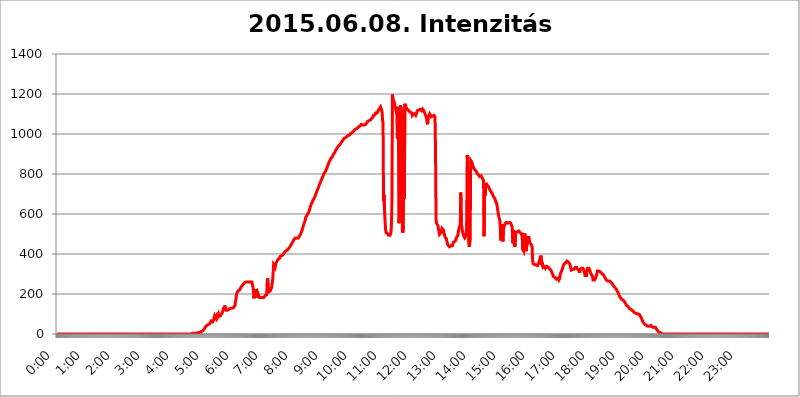
| Category | 2015.06.08. Intenzitás [W/m^2] |
|---|---|
| 0.0 | 0 |
| 0.0006944444444444445 | 0 |
| 0.001388888888888889 | 0 |
| 0.0020833333333333333 | 0 |
| 0.002777777777777778 | 0 |
| 0.003472222222222222 | 0 |
| 0.004166666666666667 | 0 |
| 0.004861111111111111 | 0 |
| 0.005555555555555556 | 0 |
| 0.0062499999999999995 | 0 |
| 0.006944444444444444 | 0 |
| 0.007638888888888889 | 0 |
| 0.008333333333333333 | 0 |
| 0.009027777777777779 | 0 |
| 0.009722222222222222 | 0 |
| 0.010416666666666666 | 0 |
| 0.011111111111111112 | 0 |
| 0.011805555555555555 | 0 |
| 0.012499999999999999 | 0 |
| 0.013194444444444444 | 0 |
| 0.013888888888888888 | 0 |
| 0.014583333333333332 | 0 |
| 0.015277777777777777 | 0 |
| 0.015972222222222224 | 0 |
| 0.016666666666666666 | 0 |
| 0.017361111111111112 | 0 |
| 0.018055555555555557 | 0 |
| 0.01875 | 0 |
| 0.019444444444444445 | 0 |
| 0.02013888888888889 | 0 |
| 0.020833333333333332 | 0 |
| 0.02152777777777778 | 0 |
| 0.022222222222222223 | 0 |
| 0.02291666666666667 | 0 |
| 0.02361111111111111 | 0 |
| 0.024305555555555556 | 0 |
| 0.024999999999999998 | 0 |
| 0.025694444444444447 | 0 |
| 0.02638888888888889 | 0 |
| 0.027083333333333334 | 0 |
| 0.027777777777777776 | 0 |
| 0.02847222222222222 | 0 |
| 0.029166666666666664 | 0 |
| 0.029861111111111113 | 0 |
| 0.030555555555555555 | 0 |
| 0.03125 | 0 |
| 0.03194444444444445 | 0 |
| 0.03263888888888889 | 0 |
| 0.03333333333333333 | 0 |
| 0.034027777777777775 | 0 |
| 0.034722222222222224 | 0 |
| 0.035416666666666666 | 0 |
| 0.036111111111111115 | 0 |
| 0.03680555555555556 | 0 |
| 0.0375 | 0 |
| 0.03819444444444444 | 0 |
| 0.03888888888888889 | 0 |
| 0.03958333333333333 | 0 |
| 0.04027777777777778 | 0 |
| 0.04097222222222222 | 0 |
| 0.041666666666666664 | 0 |
| 0.042361111111111106 | 0 |
| 0.04305555555555556 | 0 |
| 0.043750000000000004 | 0 |
| 0.044444444444444446 | 0 |
| 0.04513888888888889 | 0 |
| 0.04583333333333334 | 0 |
| 0.04652777777777778 | 0 |
| 0.04722222222222222 | 0 |
| 0.04791666666666666 | 0 |
| 0.04861111111111111 | 0 |
| 0.049305555555555554 | 0 |
| 0.049999999999999996 | 0 |
| 0.05069444444444445 | 0 |
| 0.051388888888888894 | 0 |
| 0.052083333333333336 | 0 |
| 0.05277777777777778 | 0 |
| 0.05347222222222222 | 0 |
| 0.05416666666666667 | 0 |
| 0.05486111111111111 | 0 |
| 0.05555555555555555 | 0 |
| 0.05625 | 0 |
| 0.05694444444444444 | 0 |
| 0.057638888888888885 | 0 |
| 0.05833333333333333 | 0 |
| 0.05902777777777778 | 0 |
| 0.059722222222222225 | 0 |
| 0.06041666666666667 | 0 |
| 0.061111111111111116 | 0 |
| 0.06180555555555556 | 0 |
| 0.0625 | 0 |
| 0.06319444444444444 | 0 |
| 0.06388888888888888 | 0 |
| 0.06458333333333334 | 0 |
| 0.06527777777777778 | 0 |
| 0.06597222222222222 | 0 |
| 0.06666666666666667 | 0 |
| 0.06736111111111111 | 0 |
| 0.06805555555555555 | 0 |
| 0.06874999999999999 | 0 |
| 0.06944444444444443 | 0 |
| 0.07013888888888889 | 0 |
| 0.07083333333333333 | 0 |
| 0.07152777777777779 | 0 |
| 0.07222222222222223 | 0 |
| 0.07291666666666667 | 0 |
| 0.07361111111111111 | 0 |
| 0.07430555555555556 | 0 |
| 0.075 | 0 |
| 0.07569444444444444 | 0 |
| 0.0763888888888889 | 0 |
| 0.07708333333333334 | 0 |
| 0.07777777777777778 | 0 |
| 0.07847222222222222 | 0 |
| 0.07916666666666666 | 0 |
| 0.0798611111111111 | 0 |
| 0.08055555555555556 | 0 |
| 0.08125 | 0 |
| 0.08194444444444444 | 0 |
| 0.08263888888888889 | 0 |
| 0.08333333333333333 | 0 |
| 0.08402777777777777 | 0 |
| 0.08472222222222221 | 0 |
| 0.08541666666666665 | 0 |
| 0.08611111111111112 | 0 |
| 0.08680555555555557 | 0 |
| 0.08750000000000001 | 0 |
| 0.08819444444444445 | 0 |
| 0.08888888888888889 | 0 |
| 0.08958333333333333 | 0 |
| 0.09027777777777778 | 0 |
| 0.09097222222222222 | 0 |
| 0.09166666666666667 | 0 |
| 0.09236111111111112 | 0 |
| 0.09305555555555556 | 0 |
| 0.09375 | 0 |
| 0.09444444444444444 | 0 |
| 0.09513888888888888 | 0 |
| 0.09583333333333333 | 0 |
| 0.09652777777777777 | 0 |
| 0.09722222222222222 | 0 |
| 0.09791666666666667 | 0 |
| 0.09861111111111111 | 0 |
| 0.09930555555555555 | 0 |
| 0.09999999999999999 | 0 |
| 0.10069444444444443 | 0 |
| 0.1013888888888889 | 0 |
| 0.10208333333333335 | 0 |
| 0.10277777777777779 | 0 |
| 0.10347222222222223 | 0 |
| 0.10416666666666667 | 0 |
| 0.10486111111111111 | 0 |
| 0.10555555555555556 | 0 |
| 0.10625 | 0 |
| 0.10694444444444444 | 0 |
| 0.1076388888888889 | 0 |
| 0.10833333333333334 | 0 |
| 0.10902777777777778 | 0 |
| 0.10972222222222222 | 0 |
| 0.1111111111111111 | 0 |
| 0.11180555555555556 | 0 |
| 0.11180555555555556 | 0 |
| 0.1125 | 0 |
| 0.11319444444444444 | 0 |
| 0.11388888888888889 | 0 |
| 0.11458333333333333 | 0 |
| 0.11527777777777777 | 0 |
| 0.11597222222222221 | 0 |
| 0.11666666666666665 | 0 |
| 0.1173611111111111 | 0 |
| 0.11805555555555557 | 0 |
| 0.11944444444444445 | 0 |
| 0.12013888888888889 | 0 |
| 0.12083333333333333 | 0 |
| 0.12152777777777778 | 0 |
| 0.12222222222222223 | 0 |
| 0.12291666666666667 | 0 |
| 0.12291666666666667 | 0 |
| 0.12361111111111112 | 0 |
| 0.12430555555555556 | 0 |
| 0.125 | 0 |
| 0.12569444444444444 | 0 |
| 0.12638888888888888 | 0 |
| 0.12708333333333333 | 0 |
| 0.16875 | 0 |
| 0.12847222222222224 | 0 |
| 0.12916666666666668 | 0 |
| 0.12986111111111112 | 0 |
| 0.13055555555555556 | 0 |
| 0.13125 | 0 |
| 0.13194444444444445 | 0 |
| 0.1326388888888889 | 0 |
| 0.13333333333333333 | 0 |
| 0.13402777777777777 | 0 |
| 0.13402777777777777 | 0 |
| 0.13472222222222222 | 0 |
| 0.13541666666666666 | 0 |
| 0.1361111111111111 | 0 |
| 0.13749999999999998 | 0 |
| 0.13819444444444443 | 0 |
| 0.1388888888888889 | 0 |
| 0.13958333333333334 | 0 |
| 0.14027777777777778 | 0 |
| 0.14097222222222222 | 0 |
| 0.14166666666666666 | 0 |
| 0.1423611111111111 | 0 |
| 0.14305555555555557 | 0 |
| 0.14375000000000002 | 0 |
| 0.14444444444444446 | 0 |
| 0.1451388888888889 | 0 |
| 0.1451388888888889 | 0 |
| 0.14652777777777778 | 0 |
| 0.14722222222222223 | 0 |
| 0.14791666666666667 | 0 |
| 0.1486111111111111 | 0 |
| 0.14930555555555555 | 0 |
| 0.15 | 0 |
| 0.15069444444444444 | 0 |
| 0.15138888888888888 | 0 |
| 0.15208333333333332 | 0 |
| 0.15277777777777776 | 0 |
| 0.15347222222222223 | 0 |
| 0.15416666666666667 | 0 |
| 0.15486111111111112 | 0 |
| 0.15555555555555556 | 0 |
| 0.15625 | 0 |
| 0.15694444444444444 | 0 |
| 0.15763888888888888 | 0 |
| 0.15833333333333333 | 0 |
| 0.15902777777777777 | 0 |
| 0.15972222222222224 | 0 |
| 0.16041666666666668 | 0 |
| 0.16111111111111112 | 0 |
| 0.16180555555555556 | 0 |
| 0.1625 | 0 |
| 0.16319444444444445 | 0 |
| 0.1638888888888889 | 0 |
| 0.16458333333333333 | 0 |
| 0.16527777777777777 | 0 |
| 0.16597222222222222 | 0 |
| 0.16666666666666666 | 0 |
| 0.1673611111111111 | 0 |
| 0.16805555555555554 | 0 |
| 0.16874999999999998 | 0 |
| 0.16944444444444443 | 0 |
| 0.17013888888888887 | 0 |
| 0.1708333333333333 | 0 |
| 0.17152777777777775 | 0 |
| 0.17222222222222225 | 0 |
| 0.1729166666666667 | 0 |
| 0.17361111111111113 | 0 |
| 0.17430555555555557 | 0 |
| 0.17500000000000002 | 0 |
| 0.17569444444444446 | 0 |
| 0.1763888888888889 | 0 |
| 0.17708333333333334 | 0 |
| 0.17777777777777778 | 0 |
| 0.17847222222222223 | 0 |
| 0.17916666666666667 | 0 |
| 0.1798611111111111 | 0 |
| 0.18055555555555555 | 0 |
| 0.18125 | 0 |
| 0.18194444444444444 | 0 |
| 0.1826388888888889 | 0 |
| 0.18333333333333335 | 0 |
| 0.1840277777777778 | 0 |
| 0.18472222222222223 | 0 |
| 0.18541666666666667 | 0 |
| 0.18611111111111112 | 0 |
| 0.18680555555555556 | 0 |
| 0.1875 | 0 |
| 0.18819444444444444 | 3.525 |
| 0.18888888888888888 | 3.525 |
| 0.18958333333333333 | 3.525 |
| 0.19027777777777777 | 3.525 |
| 0.1909722222222222 | 3.525 |
| 0.19166666666666665 | 3.525 |
| 0.19236111111111112 | 3.525 |
| 0.19305555555555554 | 3.525 |
| 0.19375 | 3.525 |
| 0.19444444444444445 | 3.525 |
| 0.1951388888888889 | 7.887 |
| 0.19583333333333333 | 3.525 |
| 0.19652777777777777 | 7.887 |
| 0.19722222222222222 | 7.887 |
| 0.19791666666666666 | 7.887 |
| 0.1986111111111111 | 7.887 |
| 0.19930555555555554 | 7.887 |
| 0.19999999999999998 | 7.887 |
| 0.20069444444444443 | 7.887 |
| 0.20138888888888887 | 12.257 |
| 0.2020833333333333 | 12.257 |
| 0.2027777777777778 | 12.257 |
| 0.2034722222222222 | 12.257 |
| 0.2041666666666667 | 16.636 |
| 0.20486111111111113 | 16.636 |
| 0.20555555555555557 | 21.024 |
| 0.20625000000000002 | 25.419 |
| 0.20694444444444446 | 29.823 |
| 0.2076388888888889 | 34.234 |
| 0.20833333333333334 | 38.653 |
| 0.20902777777777778 | 38.653 |
| 0.20972222222222223 | 43.079 |
| 0.21041666666666667 | 43.079 |
| 0.2111111111111111 | 47.511 |
| 0.21180555555555555 | 47.511 |
| 0.2125 | 51.951 |
| 0.21319444444444444 | 51.951 |
| 0.2138888888888889 | 51.951 |
| 0.21458333333333335 | 56.398 |
| 0.2152777777777778 | 56.398 |
| 0.21597222222222223 | 65.31 |
| 0.21666666666666667 | 65.31 |
| 0.21736111111111112 | 60.85 |
| 0.21805555555555556 | 60.85 |
| 0.21875 | 65.31 |
| 0.21944444444444444 | 69.775 |
| 0.22013888888888888 | 83.205 |
| 0.22083333333333333 | 92.184 |
| 0.22152777777777777 | 92.184 |
| 0.2222222222222222 | 83.205 |
| 0.22291666666666665 | 78.722 |
| 0.2236111111111111 | 92.184 |
| 0.22430555555555556 | 78.722 |
| 0.225 | 83.205 |
| 0.22569444444444445 | 87.692 |
| 0.2263888888888889 | 96.682 |
| 0.22708333333333333 | 87.692 |
| 0.22777777777777777 | 87.692 |
| 0.22847222222222222 | 92.184 |
| 0.22916666666666666 | 92.184 |
| 0.2298611111111111 | 96.682 |
| 0.23055555555555554 | 101.184 |
| 0.23124999999999998 | 96.682 |
| 0.23194444444444443 | 110.201 |
| 0.23263888888888887 | 119.235 |
| 0.2333333333333333 | 132.814 |
| 0.2340277777777778 | 119.235 |
| 0.2347222222222222 | 123.758 |
| 0.2354166666666667 | 141.884 |
| 0.23611111111111113 | 128.284 |
| 0.23680555555555557 | 119.235 |
| 0.23750000000000002 | 119.235 |
| 0.23819444444444446 | 119.235 |
| 0.2388888888888889 | 119.235 |
| 0.23958333333333334 | 123.758 |
| 0.24027777777777778 | 123.758 |
| 0.24097222222222223 | 123.758 |
| 0.24166666666666667 | 123.758 |
| 0.2423611111111111 | 128.284 |
| 0.24305555555555555 | 128.284 |
| 0.24375 | 123.758 |
| 0.24444444444444446 | 128.284 |
| 0.24513888888888888 | 128.284 |
| 0.24583333333333335 | 128.284 |
| 0.2465277777777778 | 132.814 |
| 0.24722222222222223 | 132.814 |
| 0.24791666666666667 | 137.347 |
| 0.24861111111111112 | 137.347 |
| 0.24930555555555556 | 141.884 |
| 0.25 | 164.605 |
| 0.25069444444444444 | 173.709 |
| 0.2513888888888889 | 196.497 |
| 0.2520833333333333 | 205.62 |
| 0.25277777777777777 | 210.182 |
| 0.2534722222222222 | 214.746 |
| 0.25416666666666665 | 214.746 |
| 0.2548611111111111 | 219.309 |
| 0.2555555555555556 | 219.309 |
| 0.25625000000000003 | 223.873 |
| 0.2569444444444445 | 228.436 |
| 0.2576388888888889 | 233 |
| 0.25833333333333336 | 237.564 |
| 0.2590277777777778 | 242.127 |
| 0.25972222222222224 | 242.127 |
| 0.2604166666666667 | 246.689 |
| 0.2611111111111111 | 251.251 |
| 0.26180555555555557 | 251.251 |
| 0.2625 | 255.813 |
| 0.26319444444444445 | 260.373 |
| 0.2638888888888889 | 260.373 |
| 0.26458333333333334 | 260.373 |
| 0.2652777777777778 | 260.373 |
| 0.2659722222222222 | 260.373 |
| 0.26666666666666666 | 260.373 |
| 0.2673611111111111 | 260.373 |
| 0.26805555555555555 | 260.373 |
| 0.26875 | 260.373 |
| 0.26944444444444443 | 260.373 |
| 0.2701388888888889 | 260.373 |
| 0.2708333333333333 | 260.373 |
| 0.27152777777777776 | 260.373 |
| 0.2722222222222222 | 260.373 |
| 0.27291666666666664 | 260.373 |
| 0.2736111111111111 | 255.813 |
| 0.2743055555555555 | 237.564 |
| 0.27499999999999997 | 223.873 |
| 0.27569444444444446 | 178.264 |
| 0.27638888888888885 | 182.82 |
| 0.27708333333333335 | 201.058 |
| 0.2777777777777778 | 187.378 |
| 0.27847222222222223 | 223.873 |
| 0.2791666666666667 | 219.309 |
| 0.2798611111111111 | 182.82 |
| 0.28055555555555556 | 178.264 |
| 0.28125 | 205.62 |
| 0.28194444444444444 | 201.058 |
| 0.2826388888888889 | 191.937 |
| 0.2833333333333333 | 182.82 |
| 0.28402777777777777 | 187.378 |
| 0.2847222222222222 | 182.82 |
| 0.28541666666666665 | 182.82 |
| 0.28611111111111115 | 182.82 |
| 0.28680555555555554 | 182.82 |
| 0.28750000000000003 | 182.82 |
| 0.2881944444444445 | 182.82 |
| 0.2888888888888889 | 182.82 |
| 0.28958333333333336 | 182.82 |
| 0.2902777777777778 | 182.82 |
| 0.29097222222222224 | 187.378 |
| 0.2916666666666667 | 191.937 |
| 0.2923611111111111 | 191.937 |
| 0.29305555555555557 | 196.497 |
| 0.29375 | 196.497 |
| 0.29444444444444445 | 260.373 |
| 0.2951388888888889 | 278.603 |
| 0.29583333333333334 | 223.873 |
| 0.2965277777777778 | 210.182 |
| 0.2972222222222222 | 210.182 |
| 0.29791666666666666 | 214.746 |
| 0.2986111111111111 | 214.746 |
| 0.29930555555555555 | 214.746 |
| 0.3 | 219.309 |
| 0.30069444444444443 | 233 |
| 0.3013888888888889 | 233 |
| 0.3020833333333333 | 269.49 |
| 0.30277777777777776 | 264.932 |
| 0.3034722222222222 | 346.682 |
| 0.30416666666666664 | 351.198 |
| 0.3048611111111111 | 342.162 |
| 0.3055555555555555 | 333.113 |
| 0.30624999999999997 | 346.682 |
| 0.3069444444444444 | 355.712 |
| 0.3076388888888889 | 360.221 |
| 0.30833333333333335 | 364.728 |
| 0.3090277777777778 | 369.23 |
| 0.30972222222222223 | 373.729 |
| 0.3104166666666667 | 378.224 |
| 0.3111111111111111 | 378.224 |
| 0.31180555555555556 | 378.224 |
| 0.3125 | 387.202 |
| 0.31319444444444444 | 391.685 |
| 0.3138888888888889 | 391.685 |
| 0.3145833333333333 | 391.685 |
| 0.31527777777777777 | 396.164 |
| 0.3159722222222222 | 396.164 |
| 0.31666666666666665 | 396.164 |
| 0.31736111111111115 | 400.638 |
| 0.31805555555555554 | 405.108 |
| 0.31875000000000003 | 409.574 |
| 0.3194444444444445 | 409.574 |
| 0.3201388888888889 | 414.035 |
| 0.32083333333333336 | 414.035 |
| 0.3215277777777778 | 418.492 |
| 0.32222222222222224 | 418.492 |
| 0.3229166666666667 | 422.943 |
| 0.3236111111111111 | 422.943 |
| 0.32430555555555557 | 427.39 |
| 0.325 | 431.833 |
| 0.32569444444444445 | 431.833 |
| 0.3263888888888889 | 436.27 |
| 0.32708333333333334 | 440.702 |
| 0.3277777777777778 | 445.129 |
| 0.3284722222222222 | 449.551 |
| 0.32916666666666666 | 453.968 |
| 0.3298611111111111 | 458.38 |
| 0.33055555555555555 | 462.786 |
| 0.33125 | 467.187 |
| 0.33194444444444443 | 471.582 |
| 0.3326388888888889 | 471.582 |
| 0.3333333333333333 | 475.972 |
| 0.3340277777777778 | 480.356 |
| 0.3347222222222222 | 480.356 |
| 0.3354166666666667 | 480.356 |
| 0.3361111111111111 | 480.356 |
| 0.3368055555555556 | 480.356 |
| 0.33749999999999997 | 480.356 |
| 0.33819444444444446 | 480.356 |
| 0.33888888888888885 | 484.735 |
| 0.33958333333333335 | 489.108 |
| 0.34027777777777773 | 489.108 |
| 0.34097222222222223 | 493.475 |
| 0.3416666666666666 | 502.192 |
| 0.3423611111111111 | 506.542 |
| 0.3430555555555555 | 515.223 |
| 0.34375 | 523.88 |
| 0.3444444444444445 | 532.513 |
| 0.3451388888888889 | 541.121 |
| 0.3458333333333334 | 549.704 |
| 0.34652777777777777 | 553.986 |
| 0.34722222222222227 | 562.53 |
| 0.34791666666666665 | 571.049 |
| 0.34861111111111115 | 583.779 |
| 0.34930555555555554 | 588.009 |
| 0.35000000000000003 | 592.233 |
| 0.3506944444444444 | 596.45 |
| 0.3513888888888889 | 600.661 |
| 0.3520833333333333 | 604.864 |
| 0.3527777777777778 | 609.062 |
| 0.3534722222222222 | 617.436 |
| 0.3541666666666667 | 625.784 |
| 0.3548611111111111 | 634.105 |
| 0.35555555555555557 | 642.4 |
| 0.35625 | 650.667 |
| 0.35694444444444445 | 654.791 |
| 0.3576388888888889 | 658.909 |
| 0.35833333333333334 | 667.123 |
| 0.3590277777777778 | 671.22 |
| 0.3597222222222222 | 675.311 |
| 0.36041666666666666 | 679.395 |
| 0.3611111111111111 | 683.473 |
| 0.36180555555555555 | 691.608 |
| 0.3625 | 695.666 |
| 0.36319444444444443 | 703.762 |
| 0.3638888888888889 | 711.832 |
| 0.3645833333333333 | 715.858 |
| 0.3652777777777778 | 723.889 |
| 0.3659722222222222 | 727.896 |
| 0.3666666666666667 | 735.89 |
| 0.3673611111111111 | 743.859 |
| 0.3680555555555556 | 747.834 |
| 0.36874999999999997 | 755.766 |
| 0.36944444444444446 | 759.723 |
| 0.37013888888888885 | 767.62 |
| 0.37083333333333335 | 771.559 |
| 0.37152777777777773 | 779.42 |
| 0.37222222222222223 | 783.342 |
| 0.3729166666666666 | 791.169 |
| 0.3736111111111111 | 798.974 |
| 0.3743055555555555 | 802.868 |
| 0.375 | 806.757 |
| 0.3756944444444445 | 806.757 |
| 0.3763888888888889 | 814.519 |
| 0.3770833333333334 | 818.392 |
| 0.37777777777777777 | 826.123 |
| 0.37847222222222227 | 833.834 |
| 0.37916666666666665 | 837.682 |
| 0.37986111111111115 | 845.365 |
| 0.38055555555555554 | 853.029 |
| 0.38125000000000003 | 860.676 |
| 0.3819444444444444 | 864.493 |
| 0.3826388888888889 | 868.305 |
| 0.3833333333333333 | 875.918 |
| 0.3840277777777778 | 879.719 |
| 0.3847222222222222 | 879.719 |
| 0.3854166666666667 | 883.516 |
| 0.3861111111111111 | 887.309 |
| 0.38680555555555557 | 894.885 |
| 0.3875 | 894.885 |
| 0.38819444444444445 | 902.447 |
| 0.3888888888888889 | 906.223 |
| 0.38958333333333334 | 909.996 |
| 0.3902777777777778 | 917.534 |
| 0.3909722222222222 | 921.298 |
| 0.39166666666666666 | 925.06 |
| 0.3923611111111111 | 928.819 |
| 0.39305555555555555 | 932.576 |
| 0.39375 | 936.33 |
| 0.39444444444444443 | 940.082 |
| 0.3951388888888889 | 943.832 |
| 0.3958333333333333 | 943.832 |
| 0.3965277777777778 | 947.58 |
| 0.3972222222222222 | 951.327 |
| 0.3979166666666667 | 955.071 |
| 0.3986111111111111 | 958.814 |
| 0.3993055555555556 | 962.555 |
| 0.39999999999999997 | 966.295 |
| 0.40069444444444446 | 970.034 |
| 0.40138888888888885 | 970.034 |
| 0.40208333333333335 | 977.508 |
| 0.40277777777777773 | 977.508 |
| 0.40347222222222223 | 981.244 |
| 0.4041666666666666 | 981.244 |
| 0.4048611111111111 | 984.98 |
| 0.4055555555555555 | 984.98 |
| 0.40625 | 988.714 |
| 0.4069444444444445 | 992.448 |
| 0.4076388888888889 | 992.448 |
| 0.4083333333333334 | 992.448 |
| 0.40902777777777777 | 996.182 |
| 0.40972222222222227 | 992.448 |
| 0.41041666666666665 | 996.182 |
| 0.41111111111111115 | 996.182 |
| 0.41180555555555554 | 1003.65 |
| 0.41250000000000003 | 1007.383 |
| 0.4131944444444444 | 1007.383 |
| 0.4138888888888889 | 1007.383 |
| 0.4145833333333333 | 1007.383 |
| 0.4152777777777778 | 1011.118 |
| 0.4159722222222222 | 1014.852 |
| 0.4166666666666667 | 1018.587 |
| 0.4173611111111111 | 1022.323 |
| 0.41805555555555557 | 1026.06 |
| 0.41875 | 1026.06 |
| 0.41944444444444445 | 1026.06 |
| 0.4201388888888889 | 1026.06 |
| 0.42083333333333334 | 1029.798 |
| 0.4215277777777778 | 1029.798 |
| 0.4222222222222222 | 1033.537 |
| 0.42291666666666666 | 1037.277 |
| 0.4236111111111111 | 1041.019 |
| 0.42430555555555555 | 1041.019 |
| 0.425 | 1041.019 |
| 0.42569444444444443 | 1044.762 |
| 0.4263888888888889 | 1048.508 |
| 0.4270833333333333 | 1048.508 |
| 0.4277777777777778 | 1048.508 |
| 0.4284722222222222 | 1044.762 |
| 0.4291666666666667 | 1044.762 |
| 0.4298611111111111 | 1044.762 |
| 0.4305555555555556 | 1044.762 |
| 0.43124999999999997 | 1048.508 |
| 0.43194444444444446 | 1048.508 |
| 0.43263888888888885 | 1048.508 |
| 0.43333333333333335 | 1052.255 |
| 0.43402777777777773 | 1056.004 |
| 0.43472222222222223 | 1059.756 |
| 0.4354166666666666 | 1063.51 |
| 0.4361111111111111 | 1063.51 |
| 0.4368055555555555 | 1063.51 |
| 0.4375 | 1067.267 |
| 0.4381944444444445 | 1067.267 |
| 0.4388888888888889 | 1067.267 |
| 0.4395833333333334 | 1071.027 |
| 0.44027777777777777 | 1074.789 |
| 0.44097222222222227 | 1078.555 |
| 0.44166666666666665 | 1082.324 |
| 0.44236111111111115 | 1082.324 |
| 0.44305555555555554 | 1086.097 |
| 0.44375000000000003 | 1093.653 |
| 0.4444444444444444 | 1093.653 |
| 0.4451388888888889 | 1093.653 |
| 0.4458333333333333 | 1097.437 |
| 0.4465277777777778 | 1105.019 |
| 0.4472222222222222 | 1105.019 |
| 0.4479166666666667 | 1101.226 |
| 0.4486111111111111 | 1105.019 |
| 0.44930555555555557 | 1108.816 |
| 0.45 | 1116.426 |
| 0.45069444444444445 | 1112.618 |
| 0.4513888888888889 | 1124.056 |
| 0.45208333333333334 | 1124.056 |
| 0.4527777777777778 | 1127.879 |
| 0.4534722222222222 | 1135.543 |
| 0.45416666666666666 | 1131.708 |
| 0.4548611111111111 | 1135.543 |
| 0.45555555555555555 | 1112.618 |
| 0.45625 | 1071.027 |
| 0.45694444444444443 | 1056.004 |
| 0.4576388888888889 | 667.123 |
| 0.4583333333333333 | 695.666 |
| 0.4590277777777778 | 617.436 |
| 0.4597222222222222 | 566.793 |
| 0.4604166666666667 | 523.88 |
| 0.4611111111111111 | 506.542 |
| 0.4618055555555556 | 506.542 |
| 0.46249999999999997 | 502.192 |
| 0.46319444444444446 | 502.192 |
| 0.46388888888888885 | 497.836 |
| 0.46458333333333335 | 493.475 |
| 0.46527777777777773 | 489.108 |
| 0.46597222222222223 | 493.475 |
| 0.4666666666666666 | 493.475 |
| 0.4673611111111111 | 497.836 |
| 0.4680555555555555 | 506.542 |
| 0.46875 | 553.986 |
| 0.4694444444444445 | 667.123 |
| 0.4701388888888889 | 1197.876 |
| 0.4708333333333334 | 1174.263 |
| 0.47152777777777777 | 1174.263 |
| 0.47222222222222227 | 1162.571 |
| 0.47291666666666665 | 1154.814 |
| 0.47361111111111115 | 1143.232 |
| 0.47430555555555554 | 1139.384 |
| 0.47500000000000003 | 1139.384 |
| 0.4756944444444444 | 1108.816 |
| 0.4763888888888889 | 1093.653 |
| 0.4770833333333333 | 977.508 |
| 0.4777777777777778 | 1135.543 |
| 0.4784722222222222 | 1108.816 |
| 0.4791666666666667 | 553.986 |
| 0.4798611111111111 | 583.779 |
| 0.48055555555555557 | 1007.383 |
| 0.48125 | 1143.232 |
| 0.48194444444444445 | 1135.543 |
| 0.4826388888888889 | 1124.056 |
| 0.48333333333333334 | 1101.226 |
| 0.4840277777777778 | 515.223 |
| 0.4847222222222222 | 506.542 |
| 0.48541666666666666 | 541.121 |
| 0.4861111111111111 | 1022.323 |
| 0.48680555555555555 | 675.311 |
| 0.4875 | 1150.946 |
| 0.48819444444444443 | 1150.946 |
| 0.4888888888888889 | 1135.543 |
| 0.4895833333333333 | 1131.708 |
| 0.4902777777777778 | 1131.708 |
| 0.4909722222222222 | 1124.056 |
| 0.4916666666666667 | 1120.238 |
| 0.4923611111111111 | 1120.238 |
| 0.4930555555555556 | 1116.426 |
| 0.49374999999999997 | 1116.426 |
| 0.49444444444444446 | 1112.618 |
| 0.49513888888888885 | 1108.816 |
| 0.49583333333333335 | 1108.816 |
| 0.49652777777777773 | 1105.019 |
| 0.49722222222222223 | 1105.019 |
| 0.4979166666666666 | 1093.653 |
| 0.4986111111111111 | 1089.873 |
| 0.4993055555555555 | 1101.226 |
| 0.5 | 1105.019 |
| 0.5006944444444444 | 1101.226 |
| 0.5013888888888889 | 1101.226 |
| 0.5020833333333333 | 1097.437 |
| 0.5027777777777778 | 1093.653 |
| 0.5034722222222222 | 1097.437 |
| 0.5041666666666667 | 1105.019 |
| 0.5048611111111111 | 1116.426 |
| 0.5055555555555555 | 1116.426 |
| 0.50625 | 1120.238 |
| 0.5069444444444444 | 1120.238 |
| 0.5076388888888889 | 1120.238 |
| 0.5083333333333333 | 1120.238 |
| 0.5090277777777777 | 1124.056 |
| 0.5097222222222222 | 1124.056 |
| 0.5104166666666666 | 1120.238 |
| 0.5111111111111112 | 1116.426 |
| 0.5118055555555555 | 1120.238 |
| 0.5125000000000001 | 1124.056 |
| 0.5131944444444444 | 1124.056 |
| 0.513888888888889 | 1120.238 |
| 0.5145833333333333 | 1112.618 |
| 0.5152777777777778 | 1105.019 |
| 0.5159722222222222 | 1101.226 |
| 0.5166666666666667 | 1093.653 |
| 0.517361111111111 | 1086.097 |
| 0.5180555555555556 | 1078.555 |
| 0.5187499999999999 | 1056.004 |
| 0.5194444444444445 | 1048.508 |
| 0.5201388888888888 | 1086.097 |
| 0.5208333333333334 | 1086.097 |
| 0.5215277777777778 | 1093.653 |
| 0.5222222222222223 | 1101.226 |
| 0.5229166666666667 | 1101.226 |
| 0.5236111111111111 | 1093.653 |
| 0.5243055555555556 | 1086.097 |
| 0.525 | 1086.097 |
| 0.5256944444444445 | 1089.873 |
| 0.5263888888888889 | 1089.873 |
| 0.5270833333333333 | 1089.873 |
| 0.5277777777777778 | 1089.873 |
| 0.5284722222222222 | 1093.653 |
| 0.5291666666666667 | 1097.437 |
| 0.5298611111111111 | 1086.097 |
| 0.5305555555555556 | 913.766 |
| 0.53125 | 575.299 |
| 0.5319444444444444 | 553.986 |
| 0.5326388888888889 | 558.261 |
| 0.5333333333333333 | 553.986 |
| 0.5340277777777778 | 541.121 |
| 0.5347222222222222 | 523.88 |
| 0.5354166666666667 | 510.885 |
| 0.5361111111111111 | 497.836 |
| 0.5368055555555555 | 493.475 |
| 0.5375 | 497.836 |
| 0.5381944444444444 | 506.542 |
| 0.5388888888888889 | 519.555 |
| 0.5395833333333333 | 528.2 |
| 0.5402777777777777 | 523.88 |
| 0.5409722222222222 | 528.2 |
| 0.5416666666666666 | 519.555 |
| 0.5423611111111112 | 506.542 |
| 0.5430555555555555 | 497.836 |
| 0.5437500000000001 | 484.735 |
| 0.5444444444444444 | 489.108 |
| 0.545138888888889 | 484.735 |
| 0.5458333333333333 | 475.972 |
| 0.5465277777777778 | 462.786 |
| 0.5472222222222222 | 453.968 |
| 0.5479166666666667 | 445.129 |
| 0.548611111111111 | 440.702 |
| 0.5493055555555556 | 440.702 |
| 0.5499999999999999 | 436.27 |
| 0.5506944444444445 | 440.702 |
| 0.5513888888888888 | 440.702 |
| 0.5520833333333334 | 440.702 |
| 0.5527777777777778 | 440.702 |
| 0.5534722222222223 | 440.702 |
| 0.5541666666666667 | 440.702 |
| 0.5548611111111111 | 445.129 |
| 0.5555555555555556 | 458.38 |
| 0.55625 | 462.786 |
| 0.5569444444444445 | 462.786 |
| 0.5576388888888889 | 462.786 |
| 0.5583333333333333 | 462.786 |
| 0.5590277777777778 | 471.582 |
| 0.5597222222222222 | 480.356 |
| 0.5604166666666667 | 484.735 |
| 0.5611111111111111 | 484.735 |
| 0.5618055555555556 | 493.475 |
| 0.5625 | 510.885 |
| 0.5631944444444444 | 523.88 |
| 0.5638888888888889 | 523.88 |
| 0.5645833333333333 | 541.121 |
| 0.5652777777777778 | 553.986 |
| 0.5659722222222222 | 707.8 |
| 0.5666666666666667 | 558.261 |
| 0.5673611111111111 | 541.121 |
| 0.5680555555555555 | 519.555 |
| 0.56875 | 506.542 |
| 0.5694444444444444 | 497.836 |
| 0.5701388888888889 | 489.108 |
| 0.5708333333333333 | 484.735 |
| 0.5715277777777777 | 480.356 |
| 0.5722222222222222 | 480.356 |
| 0.5729166666666666 | 489.108 |
| 0.5736111111111112 | 497.836 |
| 0.5743055555555555 | 571.049 |
| 0.5750000000000001 | 894.885 |
| 0.5756944444444444 | 860.676 |
| 0.576388888888889 | 617.436 |
| 0.5770833333333333 | 458.38 |
| 0.5777777777777778 | 436.27 |
| 0.5784722222222222 | 449.551 |
| 0.5791666666666667 | 471.582 |
| 0.579861111111111 | 868.305 |
| 0.5805555555555556 | 864.493 |
| 0.5812499999999999 | 860.676 |
| 0.5819444444444445 | 856.855 |
| 0.5826388888888888 | 845.365 |
| 0.5833333333333334 | 837.682 |
| 0.5840277777777778 | 829.981 |
| 0.5847222222222223 | 826.123 |
| 0.5854166666666667 | 822.26 |
| 0.5861111111111111 | 818.392 |
| 0.5868055555555556 | 818.392 |
| 0.5875 | 814.519 |
| 0.5881944444444445 | 810.641 |
| 0.5888888888888889 | 802.868 |
| 0.5895833333333333 | 798.974 |
| 0.5902777777777778 | 798.974 |
| 0.5909722222222222 | 795.074 |
| 0.5916666666666667 | 791.169 |
| 0.5923611111111111 | 787.258 |
| 0.5930555555555556 | 787.258 |
| 0.59375 | 787.258 |
| 0.5944444444444444 | 791.169 |
| 0.5951388888888889 | 787.258 |
| 0.5958333333333333 | 783.342 |
| 0.5965277777777778 | 775.492 |
| 0.5972222222222222 | 771.559 |
| 0.5979166666666667 | 767.62 |
| 0.5986111111111111 | 489.108 |
| 0.5993055555555555 | 747.834 |
| 0.6 | 691.608 |
| 0.6006944444444444 | 687.544 |
| 0.6013888888888889 | 755.766 |
| 0.6020833333333333 | 747.834 |
| 0.6027777777777777 | 743.859 |
| 0.6034722222222222 | 743.859 |
| 0.6041666666666666 | 739.877 |
| 0.6048611111111112 | 735.89 |
| 0.6055555555555555 | 731.896 |
| 0.6062500000000001 | 727.896 |
| 0.6069444444444444 | 719.877 |
| 0.607638888888889 | 719.877 |
| 0.6083333333333333 | 711.832 |
| 0.6090277777777778 | 711.832 |
| 0.6097222222222222 | 707.8 |
| 0.6104166666666667 | 699.717 |
| 0.611111111111111 | 695.666 |
| 0.6118055555555556 | 687.544 |
| 0.6124999999999999 | 687.544 |
| 0.6131944444444445 | 683.473 |
| 0.6138888888888888 | 675.311 |
| 0.6145833333333334 | 667.123 |
| 0.6152777777777778 | 663.019 |
| 0.6159722222222223 | 654.791 |
| 0.6166666666666667 | 646.537 |
| 0.6173611111111111 | 629.948 |
| 0.6180555555555556 | 613.252 |
| 0.61875 | 596.45 |
| 0.6194444444444445 | 583.779 |
| 0.6201388888888889 | 575.299 |
| 0.6208333333333333 | 566.793 |
| 0.6215277777777778 | 523.88 |
| 0.6222222222222222 | 467.187 |
| 0.6229166666666667 | 541.121 |
| 0.6236111111111111 | 549.704 |
| 0.6243055555555556 | 532.513 |
| 0.625 | 462.786 |
| 0.6256944444444444 | 523.88 |
| 0.6263888888888889 | 549.704 |
| 0.6270833333333333 | 541.121 |
| 0.6277777777777778 | 549.704 |
| 0.6284722222222222 | 545.416 |
| 0.6291666666666667 | 549.704 |
| 0.6298611111111111 | 558.261 |
| 0.6305555555555555 | 558.261 |
| 0.63125 | 558.261 |
| 0.6319444444444444 | 553.986 |
| 0.6326388888888889 | 553.986 |
| 0.6333333333333333 | 553.986 |
| 0.6340277777777777 | 558.261 |
| 0.6347222222222222 | 562.53 |
| 0.6354166666666666 | 558.261 |
| 0.6361111111111112 | 553.986 |
| 0.6368055555555555 | 549.704 |
| 0.6375000000000001 | 553.986 |
| 0.6381944444444444 | 532.513 |
| 0.638888888888889 | 453.968 |
| 0.6395833333333333 | 475.972 |
| 0.6402777777777778 | 519.555 |
| 0.6409722222222222 | 449.551 |
| 0.6416666666666667 | 436.27 |
| 0.642361111111111 | 449.551 |
| 0.6430555555555556 | 506.542 |
| 0.6437499999999999 | 510.885 |
| 0.6444444444444445 | 506.542 |
| 0.6451388888888888 | 510.885 |
| 0.6458333333333334 | 506.542 |
| 0.6465277777777778 | 506.542 |
| 0.6472222222222223 | 515.223 |
| 0.6479166666666667 | 519.555 |
| 0.6486111111111111 | 515.223 |
| 0.6493055555555556 | 506.542 |
| 0.65 | 506.542 |
| 0.6506944444444445 | 502.192 |
| 0.6513888888888889 | 497.836 |
| 0.6520833333333333 | 506.542 |
| 0.6527777777777778 | 422.943 |
| 0.6534722222222222 | 418.492 |
| 0.6541666666666667 | 414.035 |
| 0.6548611111111111 | 467.187 |
| 0.6555555555555556 | 502.192 |
| 0.65625 | 493.475 |
| 0.6569444444444444 | 480.356 |
| 0.6576388888888889 | 414.035 |
| 0.6583333333333333 | 414.035 |
| 0.6590277777777778 | 418.492 |
| 0.6597222222222222 | 480.356 |
| 0.6604166666666667 | 462.786 |
| 0.6611111111111111 | 489.108 |
| 0.6618055555555555 | 475.972 |
| 0.6625 | 462.786 |
| 0.6631944444444444 | 453.968 |
| 0.6638888888888889 | 449.551 |
| 0.6645833333333333 | 449.551 |
| 0.6652777777777777 | 445.129 |
| 0.6659722222222222 | 436.27 |
| 0.6666666666666666 | 373.729 |
| 0.6673611111111111 | 351.198 |
| 0.6680555555555556 | 351.198 |
| 0.6687500000000001 | 346.682 |
| 0.6694444444444444 | 346.682 |
| 0.6701388888888888 | 346.682 |
| 0.6708333333333334 | 346.682 |
| 0.6715277777777778 | 346.682 |
| 0.6722222222222222 | 351.198 |
| 0.6729166666666666 | 346.682 |
| 0.6736111111111112 | 342.162 |
| 0.6743055555555556 | 342.162 |
| 0.6749999999999999 | 351.198 |
| 0.6756944444444444 | 360.221 |
| 0.6763888888888889 | 351.198 |
| 0.6770833333333334 | 351.198 |
| 0.6777777777777777 | 351.198 |
| 0.6784722222222223 | 391.685 |
| 0.6791666666666667 | 346.682 |
| 0.6798611111111111 | 360.221 |
| 0.6805555555555555 | 342.162 |
| 0.68125 | 333.113 |
| 0.6819444444444445 | 328.584 |
| 0.6826388888888889 | 333.113 |
| 0.6833333333333332 | 337.639 |
| 0.6840277777777778 | 337.639 |
| 0.6847222222222222 | 328.584 |
| 0.6854166666666667 | 328.584 |
| 0.686111111111111 | 333.113 |
| 0.6868055555555556 | 337.639 |
| 0.6875 | 333.113 |
| 0.6881944444444444 | 333.113 |
| 0.688888888888889 | 333.113 |
| 0.6895833333333333 | 328.584 |
| 0.6902777777777778 | 328.584 |
| 0.6909722222222222 | 324.052 |
| 0.6916666666666668 | 324.052 |
| 0.6923611111111111 | 319.517 |
| 0.6930555555555555 | 314.98 |
| 0.69375 | 305.898 |
| 0.6944444444444445 | 301.354 |
| 0.6951388888888889 | 296.808 |
| 0.6958333333333333 | 287.709 |
| 0.6965277777777777 | 287.709 |
| 0.6972222222222223 | 287.709 |
| 0.6979166666666666 | 283.156 |
| 0.6986111111111111 | 278.603 |
| 0.6993055555555556 | 278.603 |
| 0.7000000000000001 | 274.047 |
| 0.7006944444444444 | 274.047 |
| 0.7013888888888888 | 274.047 |
| 0.7020833333333334 | 278.603 |
| 0.7027777777777778 | 274.047 |
| 0.7034722222222222 | 269.49 |
| 0.7041666666666666 | 269.49 |
| 0.7048611111111112 | 278.603 |
| 0.7055555555555556 | 301.354 |
| 0.7062499999999999 | 305.898 |
| 0.7069444444444444 | 310.44 |
| 0.7076388888888889 | 310.44 |
| 0.7083333333333334 | 324.052 |
| 0.7090277777777777 | 333.113 |
| 0.7097222222222223 | 342.162 |
| 0.7104166666666667 | 342.162 |
| 0.7111111111111111 | 351.198 |
| 0.7118055555555555 | 351.198 |
| 0.7125 | 351.198 |
| 0.7131944444444445 | 355.712 |
| 0.7138888888888889 | 360.221 |
| 0.7145833333333332 | 364.728 |
| 0.7152777777777778 | 364.728 |
| 0.7159722222222222 | 364.728 |
| 0.7166666666666667 | 360.221 |
| 0.717361111111111 | 355.712 |
| 0.7180555555555556 | 355.712 |
| 0.71875 | 351.198 |
| 0.7194444444444444 | 342.162 |
| 0.720138888888889 | 328.584 |
| 0.7208333333333333 | 319.517 |
| 0.7215277777777778 | 314.98 |
| 0.7222222222222222 | 319.517 |
| 0.7229166666666668 | 324.052 |
| 0.7236111111111111 | 328.584 |
| 0.7243055555555555 | 328.584 |
| 0.725 | 324.052 |
| 0.7256944444444445 | 328.584 |
| 0.7263888888888889 | 333.113 |
| 0.7270833333333333 | 333.113 |
| 0.7277777777777777 | 333.113 |
| 0.7284722222222223 | 333.113 |
| 0.7291666666666666 | 328.584 |
| 0.7298611111111111 | 324.052 |
| 0.7305555555555556 | 324.052 |
| 0.7312500000000001 | 324.052 |
| 0.7319444444444444 | 314.98 |
| 0.7326388888888888 | 305.898 |
| 0.7333333333333334 | 324.052 |
| 0.7340277777777778 | 328.584 |
| 0.7347222222222222 | 328.584 |
| 0.7354166666666666 | 328.584 |
| 0.7361111111111112 | 333.113 |
| 0.7368055555555556 | 328.584 |
| 0.7374999999999999 | 328.584 |
| 0.7381944444444444 | 333.113 |
| 0.7388888888888889 | 324.052 |
| 0.7395833333333334 | 305.898 |
| 0.7402777777777777 | 292.259 |
| 0.7409722222222223 | 292.259 |
| 0.7416666666666667 | 287.709 |
| 0.7423611111111111 | 292.259 |
| 0.7430555555555555 | 319.517 |
| 0.74375 | 328.584 |
| 0.7444444444444445 | 333.113 |
| 0.7451388888888889 | 333.113 |
| 0.7458333333333332 | 328.584 |
| 0.7465277777777778 | 324.052 |
| 0.7472222222222222 | 314.98 |
| 0.7479166666666667 | 305.898 |
| 0.748611111111111 | 301.354 |
| 0.7493055555555556 | 296.808 |
| 0.75 | 292.259 |
| 0.7506944444444444 | 287.709 |
| 0.751388888888889 | 269.49 |
| 0.7520833333333333 | 269.49 |
| 0.7527777777777778 | 269.49 |
| 0.7534722222222222 | 269.49 |
| 0.7541666666666668 | 274.047 |
| 0.7548611111111111 | 278.603 |
| 0.7555555555555555 | 283.156 |
| 0.75625 | 292.259 |
| 0.7569444444444445 | 296.808 |
| 0.7576388888888889 | 314.98 |
| 0.7583333333333333 | 314.98 |
| 0.7590277777777777 | 314.98 |
| 0.7597222222222223 | 314.98 |
| 0.7604166666666666 | 314.98 |
| 0.7611111111111111 | 314.98 |
| 0.7618055555555556 | 310.44 |
| 0.7625000000000001 | 305.898 |
| 0.7631944444444444 | 305.898 |
| 0.7638888888888888 | 301.354 |
| 0.7645833333333334 | 296.808 |
| 0.7652777777777778 | 296.808 |
| 0.7659722222222222 | 296.808 |
| 0.7666666666666666 | 292.259 |
| 0.7673611111111112 | 287.709 |
| 0.7680555555555556 | 283.156 |
| 0.7687499999999999 | 278.603 |
| 0.7694444444444444 | 274.047 |
| 0.7701388888888889 | 269.49 |
| 0.7708333333333334 | 269.49 |
| 0.7715277777777777 | 269.49 |
| 0.7722222222222223 | 264.932 |
| 0.7729166666666667 | 264.932 |
| 0.7736111111111111 | 264.932 |
| 0.7743055555555555 | 264.932 |
| 0.775 | 264.932 |
| 0.7756944444444445 | 260.373 |
| 0.7763888888888889 | 260.373 |
| 0.7770833333333332 | 260.373 |
| 0.7777777777777778 | 255.813 |
| 0.7784722222222222 | 251.251 |
| 0.7791666666666667 | 246.689 |
| 0.779861111111111 | 242.127 |
| 0.7805555555555556 | 242.127 |
| 0.78125 | 237.564 |
| 0.7819444444444444 | 233 |
| 0.782638888888889 | 233 |
| 0.7833333333333333 | 228.436 |
| 0.7840277777777778 | 223.873 |
| 0.7847222222222222 | 219.309 |
| 0.7854166666666668 | 214.746 |
| 0.7861111111111111 | 210.182 |
| 0.7868055555555555 | 205.62 |
| 0.7875 | 201.058 |
| 0.7881944444444445 | 191.937 |
| 0.7888888888888889 | 187.378 |
| 0.7895833333333333 | 182.82 |
| 0.7902777777777777 | 178.264 |
| 0.7909722222222223 | 178.264 |
| 0.7916666666666666 | 173.709 |
| 0.7923611111111111 | 173.709 |
| 0.7930555555555556 | 169.156 |
| 0.7937500000000001 | 169.156 |
| 0.7944444444444444 | 164.605 |
| 0.7951388888888888 | 164.605 |
| 0.7958333333333334 | 160.056 |
| 0.7965277777777778 | 155.509 |
| 0.7972222222222222 | 150.964 |
| 0.7979166666666666 | 146.423 |
| 0.7986111111111112 | 141.884 |
| 0.7993055555555556 | 141.884 |
| 0.7999999999999999 | 137.347 |
| 0.8006944444444444 | 137.347 |
| 0.8013888888888889 | 132.814 |
| 0.8020833333333334 | 128.284 |
| 0.8027777777777777 | 128.284 |
| 0.8034722222222223 | 123.758 |
| 0.8041666666666667 | 123.758 |
| 0.8048611111111111 | 119.235 |
| 0.8055555555555555 | 119.235 |
| 0.80625 | 119.235 |
| 0.8069444444444445 | 114.716 |
| 0.8076388888888889 | 114.716 |
| 0.8083333333333332 | 110.201 |
| 0.8090277777777778 | 110.201 |
| 0.8097222222222222 | 105.69 |
| 0.8104166666666667 | 105.69 |
| 0.811111111111111 | 105.69 |
| 0.8118055555555556 | 101.184 |
| 0.8125 | 101.184 |
| 0.8131944444444444 | 101.184 |
| 0.813888888888889 | 101.184 |
| 0.8145833333333333 | 101.184 |
| 0.8152777777777778 | 101.184 |
| 0.8159722222222222 | 96.682 |
| 0.8166666666666668 | 96.682 |
| 0.8173611111111111 | 92.184 |
| 0.8180555555555555 | 87.692 |
| 0.81875 | 83.205 |
| 0.8194444444444445 | 78.722 |
| 0.8201388888888889 | 74.246 |
| 0.8208333333333333 | 65.31 |
| 0.8215277777777777 | 60.85 |
| 0.8222222222222223 | 56.398 |
| 0.8229166666666666 | 56.398 |
| 0.8236111111111111 | 51.951 |
| 0.8243055555555556 | 47.511 |
| 0.8250000000000001 | 47.511 |
| 0.8256944444444444 | 43.079 |
| 0.8263888888888888 | 43.079 |
| 0.8270833333333334 | 38.653 |
| 0.8277777777777778 | 38.653 |
| 0.8284722222222222 | 38.653 |
| 0.8291666666666666 | 38.653 |
| 0.8298611111111112 | 38.653 |
| 0.8305555555555556 | 38.653 |
| 0.8312499999999999 | 43.079 |
| 0.8319444444444444 | 43.079 |
| 0.8326388888888889 | 43.079 |
| 0.8333333333333334 | 43.079 |
| 0.8340277777777777 | 38.653 |
| 0.8347222222222223 | 34.234 |
| 0.8354166666666667 | 34.234 |
| 0.8361111111111111 | 34.234 |
| 0.8368055555555555 | 34.234 |
| 0.8375 | 34.234 |
| 0.8381944444444445 | 34.234 |
| 0.8388888888888889 | 34.234 |
| 0.8395833333333332 | 29.823 |
| 0.8402777777777778 | 29.823 |
| 0.8409722222222222 | 21.024 |
| 0.8416666666666667 | 21.024 |
| 0.842361111111111 | 16.636 |
| 0.8430555555555556 | 12.257 |
| 0.84375 | 12.257 |
| 0.8444444444444444 | 12.257 |
| 0.845138888888889 | 7.887 |
| 0.8458333333333333 | 7.887 |
| 0.8465277777777778 | 3.525 |
| 0.8472222222222222 | 3.525 |
| 0.8479166666666668 | 3.525 |
| 0.8486111111111111 | 3.525 |
| 0.8493055555555555 | 0 |
| 0.85 | 0 |
| 0.8506944444444445 | 0 |
| 0.8513888888888889 | 0 |
| 0.8520833333333333 | 0 |
| 0.8527777777777777 | 0 |
| 0.8534722222222223 | 0 |
| 0.8541666666666666 | 0 |
| 0.8548611111111111 | 0 |
| 0.8555555555555556 | 0 |
| 0.8562500000000001 | 0 |
| 0.8569444444444444 | 0 |
| 0.8576388888888888 | 0 |
| 0.8583333333333334 | 0 |
| 0.8590277777777778 | 0 |
| 0.8597222222222222 | 0 |
| 0.8604166666666666 | 0 |
| 0.8611111111111112 | 0 |
| 0.8618055555555556 | 0 |
| 0.8624999999999999 | 0 |
| 0.8631944444444444 | 0 |
| 0.8638888888888889 | 0 |
| 0.8645833333333334 | 0 |
| 0.8652777777777777 | 0 |
| 0.8659722222222223 | 0 |
| 0.8666666666666667 | 0 |
| 0.8673611111111111 | 0 |
| 0.8680555555555555 | 0 |
| 0.86875 | 0 |
| 0.8694444444444445 | 0 |
| 0.8701388888888889 | 0 |
| 0.8708333333333332 | 0 |
| 0.8715277777777778 | 0 |
| 0.8722222222222222 | 0 |
| 0.8729166666666667 | 0 |
| 0.873611111111111 | 0 |
| 0.8743055555555556 | 0 |
| 0.875 | 0 |
| 0.8756944444444444 | 0 |
| 0.876388888888889 | 0 |
| 0.8770833333333333 | 0 |
| 0.8777777777777778 | 0 |
| 0.8784722222222222 | 0 |
| 0.8791666666666668 | 0 |
| 0.8798611111111111 | 0 |
| 0.8805555555555555 | 0 |
| 0.88125 | 0 |
| 0.8819444444444445 | 0 |
| 0.8826388888888889 | 0 |
| 0.8833333333333333 | 0 |
| 0.8840277777777777 | 0 |
| 0.8847222222222223 | 0 |
| 0.8854166666666666 | 0 |
| 0.8861111111111111 | 0 |
| 0.8868055555555556 | 0 |
| 0.8875000000000001 | 0 |
| 0.8881944444444444 | 0 |
| 0.8888888888888888 | 0 |
| 0.8895833333333334 | 0 |
| 0.8902777777777778 | 0 |
| 0.8909722222222222 | 0 |
| 0.8916666666666666 | 0 |
| 0.8923611111111112 | 0 |
| 0.8930555555555556 | 0 |
| 0.8937499999999999 | 0 |
| 0.8944444444444444 | 0 |
| 0.8951388888888889 | 0 |
| 0.8958333333333334 | 0 |
| 0.8965277777777777 | 0 |
| 0.8972222222222223 | 0 |
| 0.8979166666666667 | 0 |
| 0.8986111111111111 | 0 |
| 0.8993055555555555 | 0 |
| 0.9 | 0 |
| 0.9006944444444445 | 0 |
| 0.9013888888888889 | 0 |
| 0.9020833333333332 | 0 |
| 0.9027777777777778 | 0 |
| 0.9034722222222222 | 0 |
| 0.9041666666666667 | 0 |
| 0.904861111111111 | 0 |
| 0.9055555555555556 | 0 |
| 0.90625 | 0 |
| 0.9069444444444444 | 0 |
| 0.907638888888889 | 0 |
| 0.9083333333333333 | 0 |
| 0.9090277777777778 | 0 |
| 0.9097222222222222 | 0 |
| 0.9104166666666668 | 0 |
| 0.9111111111111111 | 0 |
| 0.9118055555555555 | 0 |
| 0.9125 | 0 |
| 0.9131944444444445 | 0 |
| 0.9138888888888889 | 0 |
| 0.9145833333333333 | 0 |
| 0.9152777777777777 | 0 |
| 0.9159722222222223 | 0 |
| 0.9166666666666666 | 0 |
| 0.9173611111111111 | 0 |
| 0.9180555555555556 | 0 |
| 0.9187500000000001 | 0 |
| 0.9194444444444444 | 0 |
| 0.9201388888888888 | 0 |
| 0.9208333333333334 | 0 |
| 0.9215277777777778 | 0 |
| 0.9222222222222222 | 0 |
| 0.9229166666666666 | 0 |
| 0.9236111111111112 | 0 |
| 0.9243055555555556 | 0 |
| 0.9249999999999999 | 0 |
| 0.9256944444444444 | 0 |
| 0.9263888888888889 | 0 |
| 0.9270833333333334 | 0 |
| 0.9277777777777777 | 0 |
| 0.9284722222222223 | 0 |
| 0.9291666666666667 | 0 |
| 0.9298611111111111 | 0 |
| 0.9305555555555555 | 0 |
| 0.93125 | 0 |
| 0.9319444444444445 | 0 |
| 0.9326388888888889 | 0 |
| 0.9333333333333332 | 0 |
| 0.9340277777777778 | 0 |
| 0.9347222222222222 | 0 |
| 0.9354166666666667 | 0 |
| 0.936111111111111 | 0 |
| 0.9368055555555556 | 0 |
| 0.9375 | 0 |
| 0.9381944444444444 | 0 |
| 0.938888888888889 | 0 |
| 0.9395833333333333 | 0 |
| 0.9402777777777778 | 0 |
| 0.9409722222222222 | 0 |
| 0.9416666666666668 | 0 |
| 0.9423611111111111 | 0 |
| 0.9430555555555555 | 0 |
| 0.94375 | 0 |
| 0.9444444444444445 | 0 |
| 0.9451388888888889 | 0 |
| 0.9458333333333333 | 0 |
| 0.9465277777777777 | 0 |
| 0.9472222222222223 | 0 |
| 0.9479166666666666 | 0 |
| 0.9486111111111111 | 0 |
| 0.9493055555555556 | 0 |
| 0.9500000000000001 | 0 |
| 0.9506944444444444 | 0 |
| 0.9513888888888888 | 0 |
| 0.9520833333333334 | 0 |
| 0.9527777777777778 | 0 |
| 0.9534722222222222 | 0 |
| 0.9541666666666666 | 0 |
| 0.9548611111111112 | 0 |
| 0.9555555555555556 | 0 |
| 0.9562499999999999 | 0 |
| 0.9569444444444444 | 0 |
| 0.9576388888888889 | 0 |
| 0.9583333333333334 | 0 |
| 0.9590277777777777 | 0 |
| 0.9597222222222223 | 0 |
| 0.9604166666666667 | 0 |
| 0.9611111111111111 | 0 |
| 0.9618055555555555 | 0 |
| 0.9625 | 0 |
| 0.9631944444444445 | 0 |
| 0.9638888888888889 | 0 |
| 0.9645833333333332 | 0 |
| 0.9652777777777778 | 0 |
| 0.9659722222222222 | 0 |
| 0.9666666666666667 | 0 |
| 0.967361111111111 | 0 |
| 0.9680555555555556 | 0 |
| 0.96875 | 0 |
| 0.9694444444444444 | 0 |
| 0.970138888888889 | 0 |
| 0.9708333333333333 | 0 |
| 0.9715277777777778 | 0 |
| 0.9722222222222222 | 0 |
| 0.9729166666666668 | 0 |
| 0.9736111111111111 | 0 |
| 0.9743055555555555 | 0 |
| 0.975 | 0 |
| 0.9756944444444445 | 0 |
| 0.9763888888888889 | 0 |
| 0.9770833333333333 | 0 |
| 0.9777777777777777 | 0 |
| 0.9784722222222223 | 0 |
| 0.9791666666666666 | 0 |
| 0.9798611111111111 | 0 |
| 0.9805555555555556 | 0 |
| 0.9812500000000001 | 0 |
| 0.9819444444444444 | 0 |
| 0.9826388888888888 | 0 |
| 0.9833333333333334 | 0 |
| 0.9840277777777778 | 0 |
| 0.9847222222222222 | 0 |
| 0.9854166666666666 | 0 |
| 0.9861111111111112 | 0 |
| 0.9868055555555556 | 0 |
| 0.9874999999999999 | 0 |
| 0.9881944444444444 | 0 |
| 0.9888888888888889 | 0 |
| 0.9895833333333334 | 0 |
| 0.9902777777777777 | 0 |
| 0.9909722222222223 | 0 |
| 0.9916666666666667 | 0 |
| 0.9923611111111111 | 0 |
| 0.9930555555555555 | 0 |
| 0.99375 | 0 |
| 0.9944444444444445 | 0 |
| 0.9951388888888889 | 0 |
| 0.9958333333333332 | 0 |
| 0.9965277777777778 | 0 |
| 0.9972222222222222 | 0 |
| 0.9979166666666667 | 0 |
| 0.998611111111111 | 0 |
| 0.9993055555555556 | 0 |